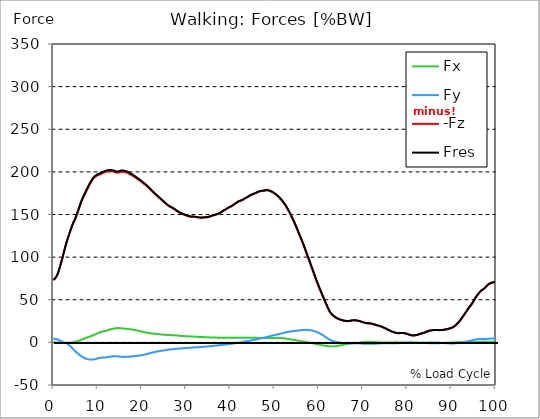
| Category |  Fx |  Fy |  -Fz |  Fres |
|---|---|---|---|---|
| 0.0 | 0.101 | 4.342 | 73.207 | 73.35 |
| 0.167348456675344 | 0.047 | 4.219 | 73.957 | 74.093 |
| 0.334696913350688 | -0.007 | 4.096 | 74.708 | 74.835 |
| 0.5020453700260321 | -0.06 | 3.958 | 75.556 | 75.672 |
| 0.669393826701376 | -0.121 | 3.781 | 76.861 | 76.966 |
| 0.83674228337672 | -0.215 | 3.539 | 78.61 | 78.703 |
| 1.0040907400520642 | -0.32 | 3.223 | 80.811 | 80.891 |
| 1.1621420602454444 | -0.426 | 2.879 | 83.214 | 83.28 |
| 1.3294905169207885 | -0.523 | 2.489 | 85.972 | 86.027 |
| 1.4968389735961325 | -0.613 | 2.088 | 88.832 | 88.878 |
| 1.6641874302714765 | -0.664 | 1.679 | 91.859 | 91.894 |
| 1.8315358869468206 | -0.703 | 1.295 | 95.015 | 95.043 |
| 1.9988843436221646 | -0.746 | 0.923 | 98.184 | 98.207 |
| 2.1662328002975086 | -0.732 | 0.573 | 101.494 | 101.512 |
| 2.333581256972853 | -0.716 | 0.25 | 104.856 | 104.872 |
| 2.5009297136481967 | -0.697 | -0.084 | 108.146 | 108.16 |
| 2.6682781703235405 | -0.683 | -0.426 | 111.446 | 111.461 |
| 2.8356266269988843 | -0.663 | -0.79 | 114.655 | 114.672 |
| 3.002975083674229 | -0.638 | -1.234 | 117.653 | 117.677 |
| 3.1703235403495724 | -0.6 | -1.742 | 120.468 | 120.5 |
| 3.337671997024917 | -0.547 | -2.297 | 123.104 | 123.148 |
| 3.4957233172182973 | -0.489 | -2.889 | 125.689 | 125.746 |
| 3.663071773893641 | -0.427 | -3.546 | 128.275 | 128.351 |
| 3.8304202305689854 | -0.35 | -4.32 | 130.826 | 130.933 |
| 3.997768687244329 | -0.269 | -5.192 | 133.301 | 133.445 |
| 4.165117143919673 | -0.172 | -6.136 | 135.66 | 135.846 |
| 4.332465600595017 | -0.058 | -7.117 | 137.95 | 138.178 |
| 4.499814057270361 | 0.11 | -8.056 | 140.009 | 140.284 |
| 4.667162513945706 | 0.347 | -8.894 | 141.791 | 142.116 |
| 4.834510970621049 | 0.582 | -9.733 | 143.571 | 143.948 |
| 5.001859427296393 | 0.833 | -10.577 | 145.627 | 146.06 |
| 5.169207883971737 | 1.08 | -11.42 | 147.885 | 148.374 |
| 5.336556340647081 | 1.321 | -12.262 | 150.248 | 150.794 |
| 5.503904797322425 | 1.594 | -13.048 | 152.65 | 153.257 |
| 5.671253253997769 | 1.87 | -13.791 | 155.087 | 155.75 |
| 5.82930457419115 | 2.167 | -14.475 | 157.596 | 158.314 |
| 5.996653030866494 | 2.479 | -15.127 | 160.144 | 160.913 |
| 6.164001487541838 | 2.854 | -15.666 | 162.664 | 163.481 |
| 6.331349944217181 | 3.2 | -16.253 | 165.001 | 165.871 |
| 6.498698400892526 | 3.537 | -16.821 | 167.122 | 168.041 |
| 6.66604685756787 | 3.874 | -17.305 | 169.023 | 169.986 |
| 6.833395314243213 | 4.192 | -17.764 | 170.829 | 171.834 |
| 7.000743770918558 | 4.49 | -18.204 | 172.564 | 173.609 |
| 7.168092227593902 | 4.819 | -18.662 | 174.322 | 175.407 |
| 7.335440684269246 | 5.145 | -19.079 | 176.097 | 177.219 |
| 7.50278914094459 | 5.464 | -19.363 | 177.921 | 179.07 |
| 7.6701375976199335 | 5.79 | -19.6 | 179.734 | 180.907 |
| 7.837486054295278 | 6.104 | -19.778 | 181.462 | 182.652 |
| 7.995537374488658 | 6.414 | -19.931 | 183.096 | 184.304 |
| 8.162885831164003 | 6.725 | -20.069 | 184.704 | 185.926 |
| 8.330234287839346 | 7.019 | -20.143 | 186.264 | 187.494 |
| 8.49758274451469 | 7.312 | -20.172 | 187.779 | 189.013 |
| 8.664931201190035 | 7.602 | -20.176 | 189.257 | 190.494 |
| 8.832279657865378 | 7.932 | -20.164 | 190.588 | 191.829 |
| 8.999628114540721 | 8.301 | -20.142 | 191.782 | 193.029 |
| 9.166976571216066 | 8.689 | -20.068 | 192.846 | 194.095 |
| 9.334325027891412 | 9.081 | -19.893 | 193.679 | 194.925 |
| 9.501673484566755 | 9.521 | -19.649 | 194.326 | 195.567 |
| 9.669021941242098 | 9.949 | -19.386 | 194.918 | 196.153 |
| 9.836370397917442 | 10.359 | -19.122 | 195.49 | 196.72 |
| 10.003718854592787 | 10.815 | -18.848 | 195.961 | 197.188 |
| 10.17106731126813 | 11.18 | -18.609 | 196.372 | 197.595 |
| 10.329118631461512 | 11.489 | -18.407 | 196.697 | 197.92 |
| 10.496467088136853 | 11.769 | -18.221 | 196.979 | 198.203 |
| 10.663815544812199 | 11.985 | -18.135 | 197.354 | 198.582 |
| 10.831164001487544 | 12.191 | -18.078 | 197.781 | 199.015 |
| 10.998512458162887 | 12.414 | -18.026 | 198.271 | 199.51 |
| 11.16586091483823 | 12.694 | -17.921 | 198.689 | 199.932 |
| 11.333209371513574 | 13.023 | -17.752 | 199.044 | 200.29 |
| 11.50055782818892 | 13.22 | -17.725 | 199.244 | 200.498 |
| 11.667906284864264 | 13.362 | -17.736 | 199.678 | 200.937 |
| 11.835254741539607 | 13.549 | -17.669 | 200.049 | 201.311 |
| 12.00260319821495 | 13.808 | -17.522 | 200.33 | 201.594 |
| 12.169951654890292 | 14.105 | -17.333 | 200.543 | 201.809 |
| 12.337300111565641 | 14.352 | -17.181 | 200.73 | 201.999 |
| 12.504648568240984 | 14.687 | -16.964 | 200.843 | 202.115 |
| 12.662699888434362 | 14.941 | -16.802 | 200.895 | 202.174 |
| 12.830048345109708 | 15.189 | -16.651 | 200.903 | 202.188 |
| 12.997396801785053 | 15.397 | -16.565 | 200.862 | 202.158 |
| 13.164745258460396 | 15.578 | -16.471 | 200.761 | 202.064 |
| 13.33209371513574 | 15.747 | -16.393 | 200.633 | 201.942 |
| 13.499442171811083 | 15.909 | -16.341 | 200.455 | 201.775 |
| 13.666790628486426 | 16.069 | -16.305 | 200.242 | 201.573 |
| 13.834139085161771 | 16.242 | -16.293 | 199.934 | 201.28 |
| 14.001487541837117 | 16.43 | -16.287 | 199.58 | 200.944 |
| 14.16883599851246 | 16.595 | -16.294 | 199.278 | 200.657 |
| 14.336184455187803 | 16.683 | -16.337 | 199.076 | 200.467 |
| 14.503532911863147 | 16.728 | -16.394 | 199.036 | 200.436 |
| 14.670881368538492 | 16.764 | -16.488 | 199.131 | 200.541 |
| 14.828932688731873 | 16.742 | -16.607 | 199.346 | 200.762 |
| 14.996281145407215 | 16.68 | -16.727 | 199.651 | 201.069 |
| 15.163629602082558 | 16.61 | -16.833 | 199.986 | 201.405 |
| 15.330978058757903 | 16.517 | -16.921 | 200.201 | 201.616 |
| 15.498326515433247 | 16.447 | -16.984 | 200.264 | 201.679 |
| 15.665674972108594 | 16.352 | -17.023 | 200.249 | 201.659 |
| 15.833023428783937 | 16.264 | -17.028 | 200.168 | 201.572 |
| 16.00037188545928 | 16.188 | -17.025 | 200.007 | 201.405 |
| 16.167720342134626 | 16.075 | -17.019 | 199.809 | 201.199 |
| 16.335068798809967 | 15.964 | -16.984 | 199.574 | 200.954 |
| 16.502417255485312 | 15.868 | -16.928 | 199.319 | 200.689 |
| 16.669765712160658 | 15.793 | -16.89 | 198.992 | 200.355 |
| 16.837114168836 | 15.716 | -16.83 | 198.598 | 199.952 |
| 17.004462625511344 | 15.62 | -16.766 | 198.173 | 199.518 |
| 17.16251394570472 | 15.529 | -16.703 | 197.707 | 199.042 |
| 17.32986240238007 | 15.417 | -16.627 | 197.228 | 198.551 |
| 17.497210859055414 | 15.31 | -16.549 | 196.756 | 198.068 |
| 17.664559315730756 | 15.192 | -16.477 | 196.267 | 197.568 |
| 17.8319077724061 | 15.054 | -16.408 | 195.767 | 197.055 |
| 17.999256229081443 | 14.912 | -16.345 | 195.251 | 196.525 |
| 18.166604685756788 | 14.766 | -16.279 | 194.727 | 195.988 |
| 18.333953142432133 | 14.598 | -16.197 | 194.143 | 195.388 |
| 18.501301599107478 | 14.435 | -16.112 | 193.52 | 194.75 |
| 18.668650055782823 | 14.276 | -16.012 | 192.882 | 194.096 |
| 18.835998512458165 | 14.104 | -15.902 | 192.272 | 193.468 |
| 19.00334696913351 | 13.921 | -15.791 | 191.692 | 192.868 |
| 19.170695425808855 | 13.702 | -15.687 | 191.163 | 192.318 |
| 19.338043882484197 | 13.484 | -15.57 | 190.593 | 191.727 |
| 19.496095202677576 | 13.272 | -15.443 | 189.975 | 191.087 |
| 19.66344365935292 | 13.063 | -15.312 | 189.325 | 190.416 |
| 19.830792116028263 | 12.848 | -15.172 | 188.659 | 189.727 |
| 19.998140572703612 | 12.65 | -15.011 | 187.967 | 189.013 |
| 20.165489029378953 | 12.454 | -14.836 | 187.264 | 188.288 |
| 20.3328374860543 | 12.256 | -14.656 | 186.579 | 187.58 |
| 20.500185942729644 | 12.056 | -14.461 | 185.888 | 186.864 |
| 20.667534399404985 | 11.864 | -14.259 | 185.243 | 186.195 |
| 20.83488285608033 | 11.679 | -14.056 | 184.61 | 185.538 |
| 21.002231312755672 | 11.475 | -13.844 | 183.907 | 184.808 |
| 21.16957976943102 | 11.311 | -13.624 | 183.134 | 184.011 |
| 21.336928226106362 | 11.157 | -13.393 | 182.299 | 183.153 |
| 21.504276682781704 | 11.021 | -13.163 | 181.472 | 182.304 |
| 21.67162513945705 | 10.886 | -12.927 | 180.613 | 181.424 |
| 21.82967645965043 | 10.75 | -12.666 | 179.727 | 180.516 |
| 21.997024916325774 | 10.621 | -12.427 | 178.871 | 179.638 |
| 22.16437337300112 | 10.501 | -12.21 | 178.056 | 178.805 |
| 22.33172182967646 | 10.395 | -11.993 | 177.248 | 177.979 |
| 22.499070286351806 | 10.293 | -11.785 | 176.421 | 177.135 |
| 22.666418743027148 | 10.192 | -11.59 | 175.575 | 176.273 |
| 22.833767199702496 | 10.102 | -11.406 | 174.739 | 175.422 |
| 23.00111565637784 | 10.019 | -11.236 | 173.92 | 174.591 |
| 23.168464113053183 | 9.918 | -11.057 | 173.093 | 173.75 |
| 23.335812569728528 | 9.826 | -10.881 | 172.315 | 172.959 |
| 23.50316102640387 | 9.727 | -10.698 | 171.618 | 172.247 |
| 23.670509483079215 | 9.636 | -10.529 | 170.836 | 171.452 |
| 23.83785793975456 | 9.551 | -10.372 | 170.04 | 170.644 |
| 23.995909259947936 | 9.466 | -10.236 | 169.277 | 169.871 |
| 24.163257716623285 | 9.377 | -10.095 | 168.509 | 169.093 |
| 24.330606173298627 | 9.285 | -9.95 | 167.744 | 168.316 |
| 24.49795462997397 | 9.202 | -9.804 | 166.953 | 167.515 |
| 24.665303086649313 | 9.118 | -9.668 | 166.179 | 166.73 |
| 24.83265154332466 | 9.041 | -9.528 | 165.4 | 165.941 |
| 25.0 | 8.976 | -9.384 | 164.622 | 165.154 |
| 25.167348456675345 | 8.923 | -9.234 | 163.849 | 164.372 |
| 25.334696913350694 | 8.876 | -9.079 | 163.08 | 163.594 |
| 25.502045370026035 | 8.827 | -8.94 | 162.342 | 162.849 |
| 25.669393826701377 | 8.779 | -8.809 | 161.625 | 162.125 |
| 25.836742283376722 | 8.737 | -8.68 | 160.939 | 161.432 |
| 26.004090740052067 | 8.689 | -8.564 | 160.279 | 160.765 |
| 26.17143919672741 | 8.636 | -8.455 | 159.664 | 160.146 |
| 26.329490516920792 | 8.579 | -8.359 | 159.104 | 159.579 |
| 26.49683897359613 | 8.535 | -8.266 | 158.687 | 159.156 |
| 26.66418743027148 | 8.49 | -8.174 | 158.271 | 158.735 |
| 26.831535886946828 | 8.447 | -8.075 | 157.84 | 158.297 |
| 26.998884343622166 | 8.407 | -7.964 | 157.382 | 157.832 |
| 27.166232800297514 | 8.354 | -7.85 | 156.833 | 157.276 |
| 27.333581256972852 | 8.299 | -7.742 | 156.237 | 156.673 |
| 27.5009297136482 | 8.242 | -7.649 | 155.66 | 156.09 |
| 27.668278170323543 | 8.167 | -7.58 | 155.07 | 155.495 |
| 27.835626626998888 | 8.093 | -7.516 | 154.468 | 154.888 |
| 28.002975083674233 | 8.016 | -7.449 | 153.85 | 154.264 |
| 28.170323540349575 | 7.935 | -7.384 | 153.258 | 153.665 |
| 28.33767199702492 | 7.861 | -7.307 | 152.707 | 153.108 |
| 28.50502045370026 | 7.79 | -7.236 | 152.254 | 152.65 |
| 28.663071773893645 | 7.725 | -7.159 | 151.828 | 152.219 |
| 28.830420230568986 | 7.66 | -7.071 | 151.426 | 151.81 |
| 28.99776868724433 | 7.596 | -6.999 | 151.035 | 151.414 |
| 29.165117143919673 | 7.534 | -6.932 | 150.648 | 151.022 |
| 29.33246560059502 | 7.475 | -6.861 | 150.279 | 150.65 |
| 29.499814057270367 | 7.412 | -6.802 | 149.937 | 150.303 |
| 29.66716251394571 | 7.353 | -6.757 | 149.608 | 149.97 |
| 29.834510970621054 | 7.302 | -6.705 | 149.282 | 149.639 |
| 30.00185942729639 | 7.256 | -6.66 | 148.943 | 149.297 |
| 30.169207883971744 | 7.214 | -6.619 | 148.565 | 148.917 |
| 30.33655634064708 | 7.167 | -6.565 | 148.247 | 148.593 |
| 30.50390479732243 | 7.121 | -6.499 | 147.97 | 148.313 |
| 30.671253253997772 | 7.076 | -6.424 | 147.742 | 148.079 |
| 30.829304574191156 | 7.025 | -6.352 | 147.594 | 147.927 |
| 30.996653030866494 | 6.97 | -6.278 | 147.497 | 147.824 |
| 31.164001487541842 | 6.928 | -6.201 | 147.43 | 147.752 |
| 31.331349944217187 | 6.873 | -6.136 | 147.38 | 147.698 |
| 31.498698400892525 | 6.825 | -6.061 | 147.339 | 147.651 |
| 31.666046857567874 | 6.781 | -5.98 | 147.292 | 147.599 |
| 31.833395314243212 | 6.736 | -5.904 | 147.222 | 147.525 |
| 32.00074377091856 | 6.679 | -5.838 | 147.136 | 147.434 |
| 32.1680922275939 | 6.616 | -5.783 | 147.036 | 147.328 |
| 32.33544068426925 | 6.552 | -5.74 | 146.912 | 147.201 |
| 32.50278914094459 | 6.507 | -5.7 | 146.771 | 147.056 |
| 32.670137597619934 | 6.477 | -5.664 | 146.6 | 146.883 |
| 32.83748605429528 | 6.438 | -5.625 | 146.454 | 146.734 |
| 33.004834510970625 | 6.393 | -5.579 | 146.356 | 146.632 |
| 33.162885831164004 | 6.353 | -5.527 | 146.292 | 146.564 |
| 33.33023428783935 | 6.307 | -5.447 | 146.275 | 146.541 |
| 33.497582744514695 | 6.269 | -5.353 | 146.281 | 146.541 |
| 33.664931201190036 | 6.234 | -5.248 | 146.299 | 146.552 |
| 33.83227965786538 | 6.2 | -5.157 | 146.34 | 146.589 |
| 33.99962811454073 | 6.147 | -5.078 | 146.41 | 146.654 |
| 34.16697657121607 | 6.091 | -5.004 | 146.487 | 146.725 |
| 34.33432502789141 | 6.044 | -4.949 | 146.563 | 146.797 |
| 34.50167348456676 | 6.006 | -4.894 | 146.637 | 146.868 |
| 34.6690219412421 | 5.994 | -4.842 | 146.706 | 146.935 |
| 34.83637039791744 | 5.971 | -4.791 | 146.809 | 147.036 |
| 35.00371885459279 | 5.939 | -4.723 | 146.961 | 147.183 |
| 35.17106731126814 | 5.895 | -4.633 | 147.193 | 147.411 |
| 35.338415767943474 | 5.844 | -4.536 | 147.465 | 147.679 |
| 35.49646708813686 | 5.789 | -4.44 | 147.766 | 147.974 |
| 35.6638155448122 | 5.742 | -4.36 | 148.082 | 148.285 |
| 35.831164001487544 | 5.702 | -4.288 | 148.407 | 148.607 |
| 35.998512458162885 | 5.684 | -4.204 | 148.751 | 148.948 |
| 36.165860914838234 | 5.664 | -4.112 | 149.033 | 149.224 |
| 36.333209371513576 | 5.639 | -4.02 | 149.292 | 149.479 |
| 36.50055782818892 | 5.619 | -3.927 | 149.512 | 149.696 |
| 36.667906284864266 | 5.604 | -3.823 | 149.702 | 149.884 |
| 36.83525474153961 | 5.581 | -3.719 | 149.966 | 150.144 |
| 37.002603198214956 | 5.559 | -3.619 | 150.268 | 150.444 |
| 37.1699516548903 | 5.539 | -3.519 | 150.594 | 150.767 |
| 37.337300111565646 | 5.519 | -3.419 | 150.962 | 151.132 |
| 37.50464856824098 | 5.504 | -3.321 | 151.383 | 151.55 |
| 37.66269988843437 | 5.487 | -3.238 | 151.833 | 151.997 |
| 37.83004834510971 | 5.467 | -3.158 | 152.297 | 152.46 |
| 37.99739680178505 | 5.446 | -3.072 | 152.847 | 153.007 |
| 38.16474525846039 | 5.421 | -2.977 | 153.493 | 153.651 |
| 38.33209371513574 | 5.413 | -2.885 | 154.059 | 154.215 |
| 38.49944217181109 | 5.413 | -2.778 | 154.56 | 154.713 |
| 38.666790628486424 | 5.407 | -2.664 | 155.059 | 155.209 |
| 38.83413908516178 | 5.397 | -2.562 | 155.59 | 155.738 |
| 39.001487541837115 | 5.386 | -2.457 | 156.109 | 156.256 |
| 39.16883599851246 | 5.375 | -2.336 | 156.628 | 156.772 |
| 39.336184455187805 | 5.364 | -2.219 | 157.138 | 157.279 |
| 39.503532911863154 | 5.359 | -2.104 | 157.66 | 157.798 |
| 39.670881368538495 | 5.355 | -1.999 | 158.187 | 158.323 |
| 39.83822982521384 | 5.345 | -1.895 | 158.636 | 158.77 |
| 39.996281145407224 | 5.337 | -1.797 | 159.003 | 159.136 |
| 40.163629602082565 | 5.328 | -1.695 | 159.45 | 159.581 |
| 40.33097805875791 | 5.317 | -1.584 | 159.964 | 160.094 |
| 40.498326515433256 | 5.307 | -1.47 | 160.493 | 160.622 |
| 40.6656749721086 | 5.307 | -1.356 | 161.055 | 161.184 |
| 40.83302342878393 | 5.308 | -1.23 | 161.672 | 161.8 |
| 41.00037188545929 | 5.307 | -1.1 | 162.284 | 162.411 |
| 41.16772034213463 | 5.307 | -0.96 | 162.921 | 163.05 |
| 41.33506879880997 | 5.303 | -0.825 | 163.579 | 163.706 |
| 41.50241725548531 | 5.31 | -0.701 | 164.193 | 164.319 |
| 41.66976571216066 | 5.327 | -0.575 | 164.746 | 164.873 |
| 41.837114168836 | 5.336 | -0.42 | 165.217 | 165.345 |
| 42.004462625511344 | 5.335 | -0.261 | 165.6 | 165.728 |
| 42.17181108218669 | 5.351 | -0.112 | 165.928 | 166.054 |
| 42.32986240238007 | 5.362 | 0.044 | 166.219 | 166.343 |
| 42.497210859055414 | 5.377 | 0.207 | 166.493 | 166.616 |
| 42.66455931573076 | 5.405 | 0.365 | 166.821 | 166.945 |
| 42.831907772406105 | 5.412 | 0.521 | 167.306 | 167.43 |
| 42.999256229081446 | 5.402 | 0.7 | 167.883 | 168.007 |
| 43.16660468575679 | 5.386 | 0.88 | 168.445 | 168.568 |
| 43.33395314243214 | 5.391 | 1.04 | 168.897 | 169.021 |
| 43.50130159910748 | 5.414 | 1.182 | 169.301 | 169.425 |
| 43.66865005578282 | 5.434 | 1.326 | 169.719 | 169.844 |
| 43.83599851245817 | 5.441 | 1.486 | 170.219 | 170.346 |
| 44.00334696913351 | 5.451 | 1.651 | 170.814 | 170.943 |
| 44.17069542580886 | 5.453 | 1.816 | 171.446 | 171.576 |
| 44.3380438824842 | 5.442 | 1.985 | 172.026 | 172.156 |
| 44.49609520267758 | 5.42 | 2.159 | 172.498 | 172.628 |
| 44.66344365935292 | 5.398 | 2.31 | 172.912 | 173.044 |
| 44.83079211602827 | 5.4 | 2.452 | 173.263 | 173.396 |
| 44.99814057270361 | 5.412 | 2.611 | 173.568 | 173.706 |
| 45.16548902937895 | 5.43 | 2.771 | 173.892 | 174.031 |
| 45.332837486054295 | 5.424 | 2.938 | 174.273 | 174.415 |
| 45.500185942729644 | 5.409 | 3.114 | 174.654 | 174.798 |
| 45.66753439940499 | 5.393 | 3.291 | 175.036 | 175.182 |
| 45.83488285608033 | 5.37 | 3.45 | 175.436 | 175.584 |
| 46.00223131275568 | 5.334 | 3.621 | 175.838 | 175.988 |
| 46.16957976943102 | 5.276 | 3.811 | 176.243 | 176.393 |
| 46.336928226106366 | 5.246 | 4.008 | 176.615 | 176.767 |
| 46.50427668278171 | 5.22 | 4.208 | 176.937 | 177.093 |
| 46.671625139457056 | 5.202 | 4.412 | 177.183 | 177.341 |
| 46.829676459650436 | 5.189 | 4.595 | 177.355 | 177.515 |
| 46.99702491632577 | 5.181 | 4.78 | 177.543 | 177.706 |
| 47.16437337300112 | 5.189 | 4.975 | 177.692 | 177.859 |
| 47.33172182967646 | 5.19 | 5.163 | 177.776 | 177.948 |
| 47.49907028635181 | 5.2 | 5.351 | 177.823 | 177.999 |
| 47.66641874302716 | 5.211 | 5.55 | 177.919 | 178.099 |
| 47.83376719970249 | 5.193 | 5.742 | 178.117 | 178.301 |
| 48.001115656377834 | 5.169 | 5.94 | 178.309 | 178.498 |
| 48.16846411305319 | 5.129 | 6.15 | 178.456 | 178.65 |
| 48.33581256972853 | 5.102 | 6.363 | 178.483 | 178.684 |
| 48.50316102640387 | 5.111 | 6.587 | 178.345 | 178.554 |
| 48.67050948307921 | 5.135 | 6.817 | 178.13 | 178.349 |
| 48.837857939754564 | 5.159 | 7.066 | 177.85 | 178.079 |
| 49.005206396429905 | 5.19 | 7.301 | 177.539 | 177.779 |
| 49.163257716623285 | 5.216 | 7.523 | 177.172 | 177.423 |
| 49.33060617329863 | 5.241 | 7.736 | 176.78 | 177.042 |
| 49.49795462997397 | 5.248 | 7.936 | 176.317 | 176.588 |
| 49.66530308664932 | 5.25 | 8.131 | 175.827 | 176.108 |
| 49.832651543324666 | 5.248 | 8.317 | 175.304 | 175.595 |
| 50.0 | 5.244 | 8.519 | 174.674 | 174.977 |
| 50.16734845667534 | 5.274 | 8.739 | 174.029 | 174.345 |
| 50.33469691335069 | 5.281 | 8.951 | 173.376 | 173.702 |
| 50.50204537002604 | 5.278 | 9.145 | 172.664 | 173.002 |
| 50.66939382670139 | 5.268 | 9.342 | 171.889 | 172.239 |
| 50.836742283376715 | 5.249 | 9.536 | 171.087 | 171.449 |
| 51.00409074005207 | 5.229 | 9.725 | 170.245 | 170.619 |
| 51.17143919672741 | 5.201 | 9.922 | 169.303 | 169.689 |
| 51.32949051692079 | 5.164 | 10.117 | 168.35 | 168.749 |
| 51.496838973596134 | 5.111 | 10.315 | 167.371 | 167.781 |
| 51.66418743027148 | 5.042 | 10.526 | 166.346 | 166.77 |
| 51.831535886946824 | 4.96 | 10.744 | 165.314 | 165.75 |
| 51.99888434362217 | 4.852 | 10.95 | 164.207 | 164.658 |
| 52.16623280029752 | 4.738 | 11.171 | 163.054 | 163.52 |
| 52.33358125697285 | 4.612 | 11.385 | 161.821 | 162.3 |
| 52.5009297136482 | 4.474 | 11.602 | 160.49 | 160.986 |
| 52.668278170323546 | 4.322 | 11.827 | 159.043 | 159.555 |
| 52.835626626998895 | 4.176 | 12.046 | 157.563 | 158.093 |
| 53.00297508367424 | 4.034 | 12.249 | 156.057 | 156.604 |
| 53.17032354034958 | 3.891 | 12.436 | 154.479 | 155.043 |
| 53.33767199702492 | 3.754 | 12.597 | 152.821 | 153.4 |
| 53.50502045370027 | 3.62 | 12.728 | 151.096 | 151.69 |
| 53.663071773893655 | 3.487 | 12.853 | 149.364 | 149.971 |
| 53.83042023056899 | 3.35 | 12.973 | 147.568 | 148.191 |
| 53.99776868724433 | 3.218 | 13.088 | 145.817 | 146.454 |
| 54.16511714391967 | 3.082 | 13.195 | 143.984 | 144.636 |
| 54.33246560059503 | 2.937 | 13.293 | 142.121 | 142.788 |
| 54.49981405727037 | 2.789 | 13.396 | 140.182 | 140.864 |
| 54.667162513945705 | 2.636 | 13.493 | 138.173 | 138.871 |
| 54.834510970621054 | 2.479 | 13.596 | 136.136 | 136.85 |
| 55.0018594272964 | 2.329 | 13.695 | 134.048 | 134.78 |
| 55.169207883971744 | 2.176 | 13.791 | 131.955 | 132.707 |
| 55.336556340647086 | 2.025 | 13.887 | 129.797 | 130.569 |
| 55.50390479732243 | 1.875 | 13.988 | 127.68 | 128.474 |
| 55.671253253997776 | 1.727 | 14.094 | 125.543 | 126.361 |
| 55.83860171067312 | 1.582 | 14.206 | 123.419 | 124.262 |
| 55.9966530308665 | 1.439 | 14.324 | 121.354 | 122.224 |
| 56.16400148754184 | 1.293 | 14.419 | 119.215 | 120.111 |
| 56.33134994421718 | 1.148 | 14.507 | 117.012 | 117.934 |
| 56.498698400892536 | 1.004 | 14.577 | 114.759 | 115.707 |
| 56.66604685756788 | 0.854 | 14.645 | 112.525 | 113.498 |
| 56.83339531424321 | 0.707 | 14.674 | 110.199 | 111.195 |
| 57.00074377091856 | 0.562 | 14.68 | 107.798 | 108.817 |
| 57.16809222759391 | 0.411 | 14.665 | 105.374 | 106.413 |
| 57.33544068426925 | 0.258 | 14.652 | 102.951 | 104.011 |
| 57.5027891409446 | 0.105 | 14.636 | 100.552 | 101.633 |
| 57.670137597619934 | -0.051 | 14.598 | 98.145 | 99.244 |
| 57.83748605429528 | -0.209 | 14.524 | 95.769 | 96.883 |
| 58.004834510970625 | -0.377 | 14.42 | 93.437 | 94.563 |
| 58.16288583116401 | -0.551 | 14.273 | 91.064 | 92.196 |
| 58.330234287839346 | -0.733 | 14.105 | 88.671 | 89.808 |
| 58.497582744514695 | -0.916 | 13.92 | 86.254 | 87.393 |
| 58.66493120119004 | -1.101 | 13.728 | 83.849 | 84.99 |
| 58.832279657865385 | -1.291 | 13.512 | 81.444 | 82.584 |
| 58.999628114540734 | -1.483 | 13.25 | 79.017 | 80.15 |
| 59.16697657121607 | -1.675 | 12.953 | 76.55 | 77.672 |
| 59.33432502789142 | -1.862 | 12.636 | 74.145 | 75.252 |
| 59.50167348456676 | -2.051 | 12.287 | 71.836 | 72.922 |
| 59.66902194124211 | -2.236 | 11.924 | 69.579 | 70.643 |
| 59.83637039791745 | -2.42 | 11.546 | 67.371 | 68.409 |
| 60.00371885459278 | -2.596 | 11.144 | 65.222 | 66.232 |
| 60.17106731126813 | -2.77 | 10.724 | 63.158 | 64.134 |
| 60.33841576794349 | -2.936 | 10.255 | 61.098 | 62.036 |
| 60.49646708813685 | -3.106 | 9.757 | 59.046 | 59.944 |
| 60.6638155448122 | -3.272 | 9.236 | 56.987 | 57.842 |
| 60.831164001487544 | -3.44 | 8.709 | 54.929 | 55.741 |
| 60.99851245816289 | -3.607 | 8.178 | 52.894 | 53.664 |
| 61.16586091483824 | -3.756 | 7.618 | 50.88 | 51.607 |
| 61.333209371513576 | -3.894 | 7.038 | 48.88 | 49.564 |
| 61.50055782818892 | -4.021 | 6.436 | 46.905 | 47.545 |
| 61.667906284864266 | -4.121 | 5.821 | 44.926 | 45.527 |
| 61.835254741539615 | -4.213 | 5.215 | 42.971 | 43.536 |
| 62.002603198214956 | -4.31 | 4.621 | 41.037 | 41.568 |
| 62.16995165489029 | -4.415 | 4.049 | 39.169 | 39.669 |
| 62.33730011156564 | -4.507 | 3.514 | 37.42 | 37.895 |
| 62.504648568240995 | -4.596 | 3.003 | 35.796 | 36.25 |
| 62.67199702491633 | -4.651 | 2.601 | 34.542 | 34.982 |
| 62.83004834510971 | -4.69 | 2.215 | 33.465 | 33.893 |
| 62.99739680178505 | -4.718 | 1.869 | 32.486 | 32.904 |
| 63.1647452584604 | -4.715 | 1.598 | 31.708 | 32.121 |
| 63.33209371513575 | -4.699 | 1.346 | 31.001 | 31.408 |
| 63.4994421718111 | -4.671 | 1.095 | 30.308 | 30.708 |
| 63.666790628486424 | -4.631 | 0.851 | 29.637 | 30.03 |
| 63.83413908516177 | -4.564 | 0.629 | 29.032 | 29.414 |
| 64.00148754183712 | -4.447 | 0.45 | 28.521 | 28.887 |
| 64.16883599851248 | -4.3 | 0.279 | 28.072 | 28.419 |
| 64.3361844551878 | -4.13 | 0.104 | 27.666 | 27.992 |
| 64.50353291186315 | -3.947 | -0.068 | 27.293 | 27.598 |
| 64.6708813685385 | -3.764 | -0.242 | 26.943 | 27.229 |
| 64.83822982521384 | -3.59 | -0.404 | 26.617 | 26.884 |
| 65.00557828188919 | -3.413 | -0.551 | 26.321 | 26.57 |
| 65.16362960208257 | -3.249 | -0.664 | 26.087 | 26.321 |
| 65.3309780587579 | -3.079 | -0.784 | 25.85 | 26.069 |
| 65.49832651543326 | -2.901 | -0.891 | 25.632 | 25.834 |
| 65.6656749721086 | -2.723 | -0.974 | 25.44 | 25.627 |
| 65.83302342878395 | -2.54 | -1.044 | 25.275 | 25.448 |
| 66.00037188545929 | -2.361 | -1.106 | 25.121 | 25.28 |
| 66.16772034213463 | -2.183 | -1.156 | 24.98 | 25.126 |
| 66.33506879880998 | -2.006 | -1.203 | 24.89 | 25.024 |
| 66.50241725548531 | -1.838 | -1.237 | 24.852 | 24.978 |
| 66.66976571216065 | -1.698 | -1.22 | 24.932 | 25.049 |
| 66.83711416883601 | -1.572 | -1.198 | 25.048 | 25.155 |
| 67.00446262551135 | -1.461 | -1.148 | 25.193 | 25.293 |
| 67.1718110821867 | -1.357 | -1.099 | 25.364 | 25.456 |
| 67.32986240238007 | -1.27 | -1.071 | 25.524 | 25.608 |
| 67.49721085905541 | -1.188 | -1.039 | 25.674 | 25.751 |
| 67.66455931573076 | -1.116 | -0.999 | 25.805 | 25.876 |
| 67.83190777240611 | -1.062 | -0.987 | 25.868 | 25.935 |
| 67.99925622908145 | -1.005 | -0.97 | 25.893 | 25.954 |
| 68.16660468575678 | -0.94 | -0.954 | 25.888 | 25.945 |
| 68.33395314243214 | -0.861 | -0.964 | 25.809 | 25.864 |
| 68.50130159910749 | -0.777 | -0.989 | 25.707 | 25.759 |
| 68.66865005578282 | -0.69 | -1.021 | 25.596 | 25.646 |
| 68.83599851245816 | -0.617 | -1.064 | 25.444 | 25.493 |
| 69.00334696913352 | -0.492 | -1.118 | 25.255 | 25.305 |
| 69.17069542580886 | -0.363 | -1.178 | 25.053 | 25.105 |
| 69.3380438824842 | -0.252 | -1.236 | 24.81 | 24.867 |
| 69.50539233915956 | -0.148 | -1.309 | 24.524 | 24.586 |
| 69.66344365935292 | -0.07 | -1.385 | 24.21 | 24.276 |
| 69.83079211602826 | 0.012 | -1.464 | 23.882 | 23.954 |
| 69.99814057270362 | 0.11 | -1.541 | 23.572 | 23.65 |
| 70.16548902937896 | 0.206 | -1.612 | 23.294 | 23.376 |
| 70.33283748605429 | 0.323 | -1.677 | 23.047 | 23.133 |
| 70.50018594272964 | 0.452 | -1.707 | 22.857 | 22.946 |
| 70.667534399405 | 0.543 | -1.743 | 22.687 | 22.781 |
| 70.83488285608033 | 0.595 | -1.755 | 22.556 | 22.652 |
| 71.00223131275568 | 0.65 | -1.759 | 22.45 | 22.549 |
| 71.16957976943102 | 0.677 | -1.749 | 22.371 | 22.471 |
| 71.33692822610637 | 0.692 | -1.736 | 22.31 | 22.411 |
| 71.50427668278171 | 0.68 | -1.718 | 22.226 | 22.325 |
| 71.67162513945706 | 0.637 | -1.694 | 22.113 | 22.209 |
| 71.8389735961324 | 0.593 | -1.68 | 21.964 | 22.059 |
| 71.99702491632577 | 0.55 | -1.676 | 21.779 | 21.874 |
| 72.16437337300113 | 0.514 | -1.67 | 21.536 | 21.631 |
| 72.33172182967647 | 0.472 | -1.636 | 21.315 | 21.406 |
| 72.49907028635181 | 0.418 | -1.589 | 21.103 | 21.188 |
| 72.66641874302715 | 0.364 | -1.563 | 20.842 | 20.923 |
| 72.8337671997025 | 0.311 | -1.538 | 20.555 | 20.634 |
| 73.00111565637783 | 0.25 | -1.494 | 20.272 | 20.344 |
| 73.16846411305319 | 0.194 | -1.448 | 20.026 | 20.094 |
| 73.33581256972853 | 0.137 | -1.383 | 19.818 | 19.879 |
| 73.50316102640387 | 0.081 | -1.321 | 19.602 | 19.657 |
| 73.67050948307921 | 0.025 | -1.267 | 19.365 | 19.418 |
| 73.83785793975457 | -0.021 | -1.221 | 19.11 | 19.16 |
| 74.00520639642991 | -0.057 | -1.18 | 18.842 | 18.89 |
| 74.16325771662328 | -0.078 | -1.155 | 18.489 | 18.537 |
| 74.33060617329863 | -0.092 | -1.142 | 18.113 | 18.164 |
| 74.49795462997398 | -0.1 | -1.147 | 17.726 | 17.779 |
| 74.66530308664932 | -0.115 | -1.131 | 17.351 | 17.407 |
| 74.83265154332466 | -0.131 | -1.104 | 16.972 | 17.03 |
| 75.00000000000001 | -0.148 | -1.072 | 16.587 | 16.645 |
| 75.16734845667534 | -0.159 | -1.042 | 16.19 | 16.25 |
| 75.3346969133507 | -0.161 | -1.016 | 15.751 | 15.812 |
| 75.50204537002605 | -0.152 | -0.993 | 15.282 | 15.344 |
| 75.66939382670138 | -0.138 | -0.985 | 14.815 | 14.879 |
| 75.83674228337672 | -0.124 | -0.98 | 14.36 | 14.425 |
| 76.00409074005208 | -0.114 | -0.976 | 13.938 | 14.005 |
| 76.17143919672742 | -0.097 | -0.979 | 13.531 | 13.6 |
| 76.33878765340276 | -0.073 | -0.984 | 13.137 | 13.21 |
| 76.49683897359614 | -0.043 | -0.993 | 12.746 | 12.821 |
| 76.66418743027148 | -0.013 | -1.006 | 12.379 | 12.457 |
| 76.83153588694682 | 0.01 | -1.021 | 12.068 | 12.15 |
| 76.99888434362218 | 0.01 | -1.013 | 11.808 | 11.893 |
| 77.16623280029752 | 0.015 | -1.02 | 11.551 | 11.637 |
| 77.33358125697285 | 0.02 | -1.016 | 11.306 | 11.393 |
| 77.5009297136482 | 0.023 | -1.006 | 11.088 | 11.176 |
| 77.66827817032356 | 0.025 | -0.993 | 10.893 | 10.98 |
| 77.83562662699889 | 0.023 | -0.984 | 10.765 | 10.85 |
| 78.00297508367423 | -0.006 | -0.934 | 10.739 | 10.815 |
| 78.17032354034959 | -0.041 | -0.871 | 10.778 | 10.846 |
| 78.33767199702493 | -0.078 | -0.808 | 10.853 | 10.914 |
| 78.50502045370027 | -0.12 | -0.736 | 10.919 | 10.973 |
| 78.67236891037561 | -0.175 | -0.646 | 10.965 | 11.012 |
| 78.83042023056899 | -0.223 | -0.55 | 10.988 | 11.03 |
| 78.99776868724433 | -0.268 | -0.456 | 10.983 | 11.023 |
| 79.16511714391969 | -0.316 | -0.385 | 10.902 | 10.942 |
| 79.33246560059503 | -0.354 | -0.335 | 10.782 | 10.824 |
| 79.49981405727036 | -0.385 | -0.291 | 10.636 | 10.679 |
| 79.66716251394571 | -0.402 | -0.243 | 10.42 | 10.463 |
| 79.83451097062107 | -0.421 | -0.191 | 10.171 | 10.212 |
| 80.00185942729641 | -0.423 | -0.162 | 9.919 | 9.961 |
| 80.16920788397174 | -0.421 | -0.135 | 9.647 | 9.689 |
| 80.33655634064709 | -0.407 | -0.136 | 9.325 | 9.368 |
| 80.50390479732243 | -0.387 | -0.15 | 8.999 | 9.042 |
| 80.67125325399778 | -0.355 | -0.184 | 8.672 | 8.714 |
| 80.83860171067312 | -0.326 | -0.218 | 8.393 | 8.436 |
| 80.99665303086651 | -0.297 | -0.265 | 8.234 | 8.276 |
| 81.16400148754184 | -0.275 | -0.329 | 8.164 | 8.206 |
| 81.3313499442172 | -0.251 | -0.395 | 8.139 | 8.18 |
| 81.49869840089255 | -0.234 | -0.464 | 8.158 | 8.2 |
| 81.66604685756786 | -0.218 | -0.537 | 8.212 | 8.255 |
| 81.83339531424322 | -0.22 | -0.581 | 8.307 | 8.351 |
| 82.00074377091858 | -0.221 | -0.622 | 8.446 | 8.493 |
| 82.16809222759392 | -0.232 | -0.653 | 8.63 | 8.679 |
| 82.33544068426926 | -0.261 | -0.653 | 8.861 | 8.908 |
| 82.50278914094459 | -0.3 | -0.621 | 9.123 | 9.168 |
| 82.67013759761994 | -0.33 | -0.615 | 9.402 | 9.445 |
| 82.83748605429528 | -0.363 | -0.611 | 9.693 | 9.735 |
| 83.00483451097062 | -0.41 | -0.591 | 10.012 | 10.052 |
| 83.17218296764597 | -0.452 | -0.578 | 10.318 | 10.359 |
| 83.33023428783935 | -0.487 | -0.558 | 10.578 | 10.619 |
| 83.4975827445147 | -0.524 | -0.527 | 10.779 | 10.821 |
| 83.66493120119004 | -0.565 | -0.486 | 10.982 | 11.022 |
| 83.83227965786537 | -0.611 | -0.445 | 11.282 | 11.321 |
| 83.99962811454073 | -0.661 | -0.402 | 11.615 | 11.655 |
| 84.16697657121607 | -0.713 | -0.379 | 11.986 | 12.027 |
| 84.33432502789142 | -0.764 | -0.361 | 12.363 | 12.405 |
| 84.50167348456677 | -0.808 | -0.334 | 12.707 | 12.75 |
| 84.6690219412421 | -0.853 | -0.3 | 13.019 | 13.062 |
| 84.83637039791745 | -0.888 | -0.271 | 13.299 | 13.343 |
| 85.0037188545928 | -0.924 | -0.238 | 13.557 | 13.602 |
| 85.17106731126813 | -0.958 | -0.211 | 13.781 | 13.828 |
| 85.33841576794349 | -0.983 | -0.197 | 13.967 | 14.016 |
| 85.50576422461883 | -1.002 | -0.185 | 14.117 | 14.167 |
| 85.66381554481221 | -1.023 | -0.182 | 14.226 | 14.279 |
| 85.83116400148755 | -1.044 | -0.165 | 14.336 | 14.39 |
| 85.99851245816289 | -1.058 | -0.132 | 14.448 | 14.503 |
| 86.16586091483823 | -1.05 | -0.131 | 14.519 | 14.574 |
| 86.33320937151358 | -1.045 | -0.142 | 14.543 | 14.6 |
| 86.50055782818893 | -1.034 | -0.156 | 14.541 | 14.598 |
| 86.66790628486427 | -1.02 | -0.179 | 14.508 | 14.567 |
| 86.83525474153961 | -0.994 | -0.221 | 14.442 | 14.5 |
| 87.00260319821496 | -0.961 | -0.293 | 14.378 | 14.435 |
| 87.16995165489031 | -0.924 | -0.379 | 14.33 | 14.386 |
| 87.33730011156564 | -0.894 | -0.448 | 14.328 | 14.385 |
| 87.504648568241 | -0.865 | -0.498 | 14.347 | 14.405 |
| 87.67199702491634 | -0.827 | -0.565 | 14.39 | 14.447 |
| 87.83004834510972 | -0.786 | -0.636 | 14.468 | 14.525 |
| 87.99739680178506 | -0.748 | -0.689 | 14.573 | 14.629 |
| 88.1647452584604 | -0.702 | -0.749 | 14.678 | 14.736 |
| 88.33209371513574 | -0.66 | -0.812 | 14.797 | 14.856 |
| 88.49944217181108 | -0.629 | -0.888 | 14.925 | 14.986 |
| 88.66679062848644 | -0.596 | -0.955 | 15.088 | 15.15 |
| 88.83413908516178 | -0.565 | -1.015 | 15.268 | 15.333 |
| 89.00148754183712 | -0.519 | -1.073 | 15.454 | 15.521 |
| 89.16883599851246 | -0.479 | -1.129 | 15.668 | 15.738 |
| 89.33618445518782 | -0.435 | -1.154 | 15.893 | 15.964 |
| 89.50353291186315 | -0.38 | -1.183 | 16.111 | 16.18 |
| 89.6708813685385 | -0.338 | -1.215 | 16.371 | 16.44 |
| 89.83822982521386 | -0.288 | -1.25 | 16.632 | 16.7 |
| 90.00557828188919 | -0.232 | -1.279 | 16.934 | 17.001 |
| 90.16362960208257 | -0.185 | -1.292 | 17.321 | 17.387 |
| 90.3309780587579 | -0.147 | -1.291 | 17.761 | 17.824 |
| 90.49832651543326 | -0.107 | -1.275 | 18.243 | 18.303 |
| 90.66567497210859 | -0.066 | -1.238 | 18.825 | 18.882 |
| 90.83302342878395 | -0.012 | -1.187 | 19.517 | 19.567 |
| 91.00037188545929 | 0.033 | -1.113 | 20.272 | 20.318 |
| 91.16772034213463 | 0.07 | -1.011 | 21.084 | 21.126 |
| 91.33506879880998 | 0.107 | -0.892 | 21.966 | 22.003 |
| 91.50241725548533 | 0.146 | -0.773 | 22.905 | 22.937 |
| 91.66976571216065 | 0.186 | -0.654 | 23.878 | 23.906 |
| 91.83711416883601 | 0.227 | -0.519 | 24.869 | 24.894 |
| 92.00446262551137 | 0.253 | -0.369 | 25.935 | 25.956 |
| 92.1718110821867 | 0.244 | -0.214 | 27.104 | 27.122 |
| 92.33915953886203 | 0.225 | -0.065 | 28.311 | 28.327 |
| 92.49721085905541 | 0.207 | 0.099 | 29.569 | 29.583 |
| 92.66455931573077 | 0.19 | 0.26 | 30.843 | 30.857 |
| 92.83190777240611 | 0.174 | 0.407 | 32.1 | 32.115 |
| 92.99925622908145 | 0.172 | 0.57 | 33.363 | 33.379 |
| 93.1666046857568 | 0.172 | 0.719 | 34.607 | 34.626 |
| 93.33395314243214 | 0.167 | 0.882 | 35.875 | 35.897 |
| 93.50130159910749 | 0.161 | 1.048 | 37.156 | 37.183 |
| 93.66865005578283 | 0.152 | 1.235 | 38.479 | 38.511 |
| 93.83599851245818 | 0.151 | 1.43 | 39.757 | 39.795 |
| 94.00334696913353 | 0.164 | 1.625 | 40.996 | 41.042 |
| 94.17069542580886 | 0.19 | 1.806 | 42.135 | 42.187 |
| 94.3380438824842 | 0.232 | 1.921 | 43.122 | 43.179 |
| 94.50539233915954 | 0.259 | 2.078 | 44.221 | 44.284 |
| 94.66344365935292 | 0.274 | 2.268 | 45.474 | 45.544 |
| 94.83079211602828 | 0.283 | 2.453 | 46.843 | 46.92 |
| 94.99814057270362 | 0.27 | 2.7 | 48.381 | 48.467 |
| 95.16548902937897 | 0.262 | 2.934 | 49.923 | 50.021 |
| 95.33283748605432 | 0.264 | 3.142 | 51.395 | 51.502 |
| 95.50018594272963 | 0.285 | 3.341 | 52.733 | 52.85 |
| 95.66753439940499 | 0.322 | 3.53 | 53.997 | 54.123 |
| 95.83488285608034 | 0.357 | 3.618 | 55.104 | 55.234 |
| 96.00223131275567 | 0.399 | 3.721 | 56.251 | 56.385 |
| 96.16957976943102 | 0.449 | 3.807 | 57.357 | 57.494 |
| 96.33692822610638 | 0.495 | 3.869 | 58.448 | 58.586 |
| 96.50427668278171 | 0.536 | 3.91 | 59.44 | 59.579 |
| 96.67162513945706 | 0.58 | 3.932 | 60.231 | 60.369 |
| 96.8389735961324 | 0.62 | 3.918 | 60.921 | 61.058 |
| 96.99702491632577 | 0.66 | 3.903 | 61.537 | 61.671 |
| 97.16437337300111 | 0.697 | 3.899 | 62.141 | 62.273 |
| 97.33172182967647 | 0.729 | 3.908 | 62.741 | 62.873 |
| 97.49907028635181 | 0.749 | 3.94 | 63.422 | 63.554 |
| 97.66641874302715 | 0.759 | 3.999 | 64.257 | 64.392 |
| 97.8337671997025 | 0.754 | 4.057 | 65.207 | 65.342 |
| 98.00111565637785 | 0.737 | 4.11 | 66.203 | 66.34 |
| 98.16846411305319 | 0.702 | 4.187 | 67.168 | 67.308 |
| 98.33581256972855 | 0.666 | 4.238 | 67.958 | 68.099 |
| 98.50316102640389 | 0.656 | 4.29 | 68.58 | 68.725 |
| 98.67050948307921 | 0.679 | 4.341 | 68.99 | 69.138 |
| 98.83785793975456 | 0.717 | 4.433 | 69.366 | 69.521 |
| 99.0052063964299 | 0.74 | 4.507 | 69.692 | 69.85 |
| 99.17255485310525 | 0.751 | 4.561 | 69.944 | 70.106 |
| 99.33060617329863 | 0.762 | 4.607 | 70.185 | 70.349 |
| 99.49795462997399 | 0.773 | 4.656 | 70.388 | 70.554 |
| 99.66530308664933 | 0.768 | 4.681 | 70.486 | 70.653 |
| 99.83265154332467 | 0.762 | 4.71 | 70.614 | 70.783 |
| 100.0 | 0.753 | 4.75 | 70.864 | 71.036 |